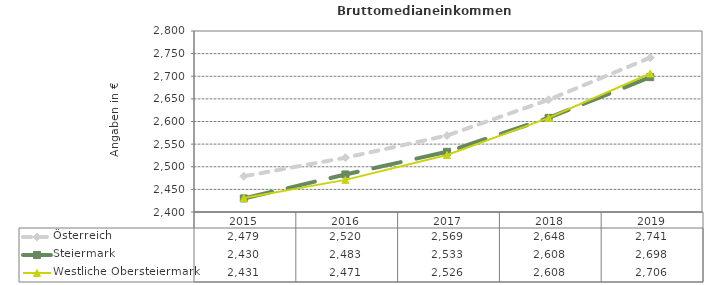
| Category | Österreich | Steiermark | Westliche Obersteiermark |
|---|---|---|---|
| 2019.0 | 2741 | 2698 | 2706 |
| 2018.0 | 2648 | 2608 | 2608 |
| 2017.0 | 2569 | 2533 | 2526 |
| 2016.0 | 2520 | 2483 | 2471 |
| 2015.0 | 2479 | 2430 | 2431 |